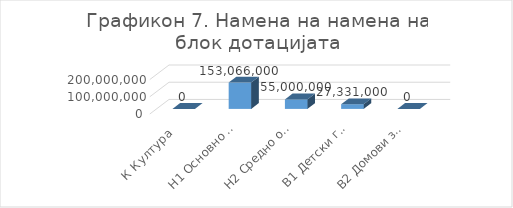
| Category | Износ |
|---|---|
| К Култура  | 0 |
| H1 Основно образование | 153066000 |
| H2 Средно образование | 55000000 |
| B1 Детски градинки | 27331000 |
| B2 Домови за стари лица  | 0 |